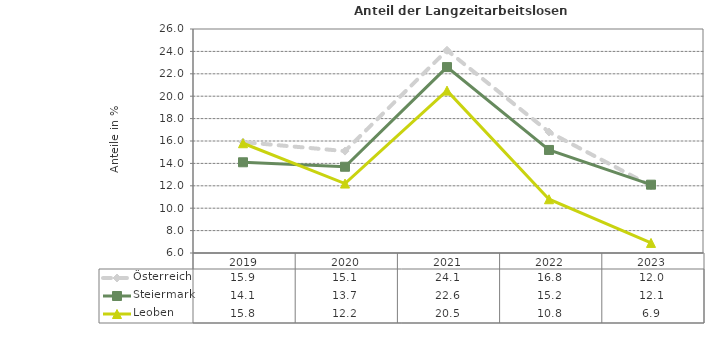
| Category | Österreich | Steiermark | Leoben |
|---|---|---|---|
| 2023.0 | 12 | 12.1 | 6.9 |
| 2022.0 | 16.8 | 15.2 | 10.8 |
| 2021.0 | 24.1 | 22.6 | 20.5 |
| 2020.0 | 15.1 | 13.7 | 12.2 |
| 2019.0 | 15.9 | 14.1 | 15.8 |